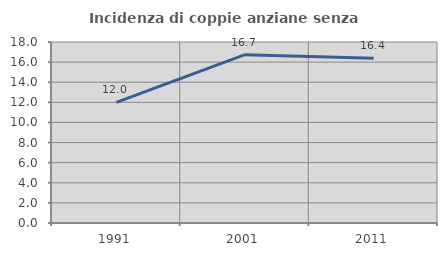
| Category | Incidenza di coppie anziane senza figli  |
|---|---|
| 1991.0 | 12 |
| 2001.0 | 16.741 |
| 2011.0 | 16.39 |